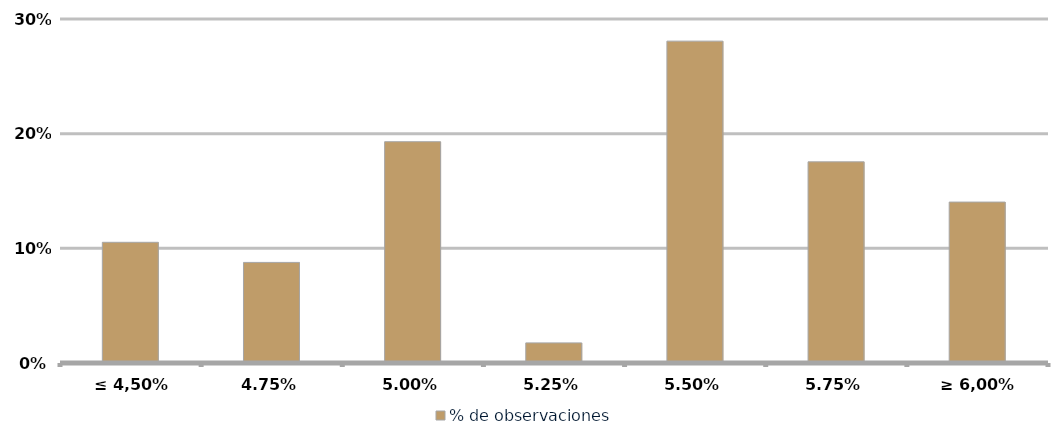
| Category | % de observaciones  |
|---|---|
| ≤ 4,50% | 0.105 |
| 4,75% | 0.088 |
| 5,00% | 0.193 |
| 5,25% | 0.018 |
| 5,50% | 0.281 |
| 5,75% | 0.175 |
| ≥ 6,00% | 0.14 |